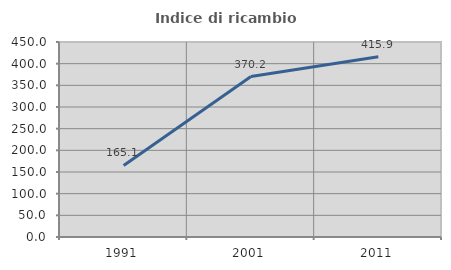
| Category | Indice di ricambio occupazionale  |
|---|---|
| 1991.0 | 165.116 |
| 2001.0 | 370.175 |
| 2011.0 | 415.873 |